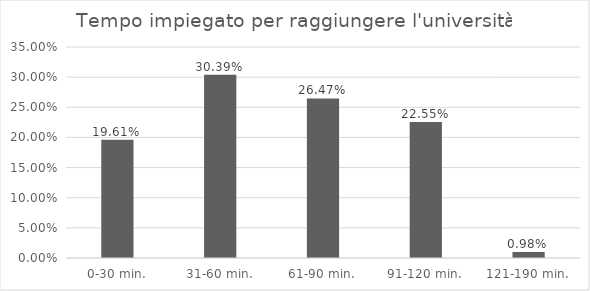
| Category | Percentuale |
|---|---|
| 0-30 min. | 0.196 |
| 31-60 min. | 0.304 |
| 61-90 min. | 0.265 |
| 91-120 min. | 0.226 |
| 121-190 min. | 0.01 |